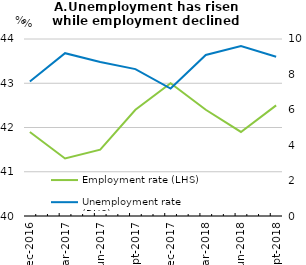
| Category | Employment rate (LHS) |
|---|---|
| Jun-16 | 41.7 |
| Sep-16 | 42.1 |
| Dec-16 | 41.9 |
| Mar-17 | 41.3 |
| Jun-17 | 41.5 |
| Sep-17 | 42.4 |
| Dec-17 | 43 |
| Mar-18 | 42.4 |
| Jun-18 | 41.9 |
| Sep-18 | 42.5 |